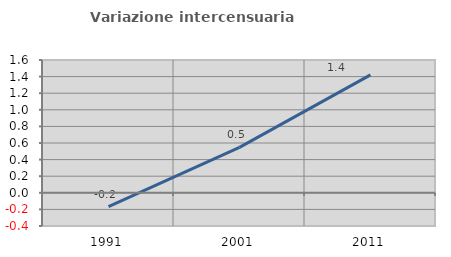
| Category | Variazione intercensuaria annua |
|---|---|
| 1991.0 | -0.166 |
| 2001.0 | 0.548 |
| 2011.0 | 1.421 |